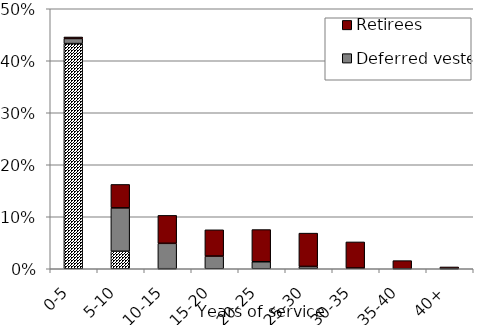
| Category | Non-vested | Deferred vested | Retirees |
|---|---|---|---|
| 0-5 | 0.433 | 0.01 | 0.003 |
| 5-10 | 0.034 | 0.083 | 0.045 |
| 10-15 | 0 | 0.049 | 0.054 |
| 15-20 | 0 | 0.024 | 0.051 |
| 20-25 | 0 | 0.013 | 0.062 |
| 25-30 | 0 | 0.004 | 0.064 |
| 30-35 | 0 | 0.001 | 0.05 |
| 35-40 | 0 | 0 | 0.016 |
| 40+ | 0 | 0 | 0.003 |